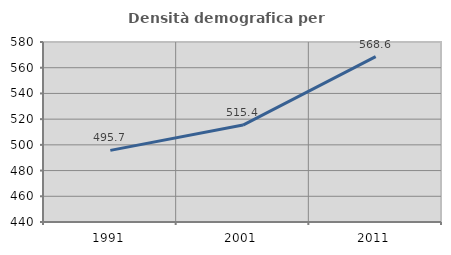
| Category | Densità demografica |
|---|---|
| 1991.0 | 495.728 |
| 2001.0 | 515.376 |
| 2011.0 | 568.598 |